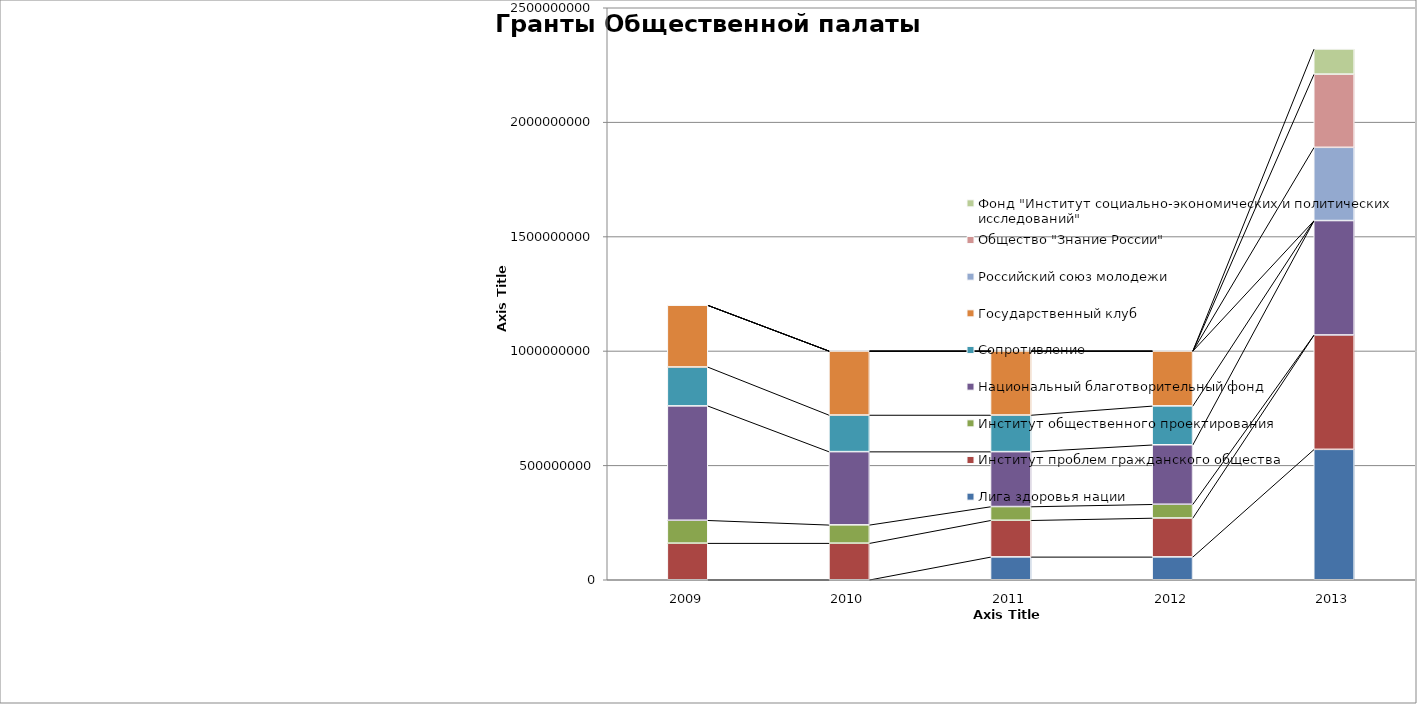
| Category | Лига здоровья нации | Институт проблем гражданского общества | Институт общественного проектирования | Национальный благотворительный фонд | Сопротивление | Государственный клуб | Российский союз молодежи | Общество "Знание России" | Фонд "Институт социально-экономических и политических исследований" |
|---|---|---|---|---|---|---|---|---|---|
| 2009.0 | 0 | 160000000 | 100000000 | 500000000 | 170000000 | 270000000 | 0 | 0 | 0 |
| 2010.0 | 0 | 160000000 | 80000000 | 320000000 | 160000000 | 280000000 | 0 | 0 | 0 |
| 2011.0 | 100000000 | 160000000 | 60000000 | 240000000 | 160000000 | 280000000 | 0 | 0 | 0 |
| 2012.0 | 100000000 | 170000000 | 60000000 | 260000000 | 170000000 | 240000000 | 0 | 0 | 0 |
| 2013.0 | 570000000 | 500000000 | 0 | 500000000 | 0 | 0 | 320000000 | 320000000 | 110000000 |